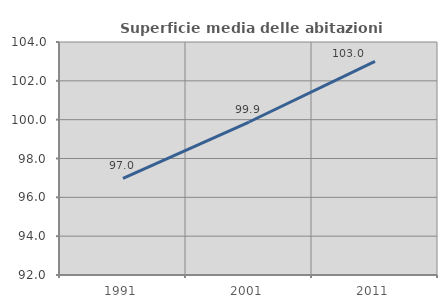
| Category | Superficie media delle abitazioni occupate |
|---|---|
| 1991.0 | 96.978 |
| 2001.0 | 99.879 |
| 2011.0 | 103.001 |